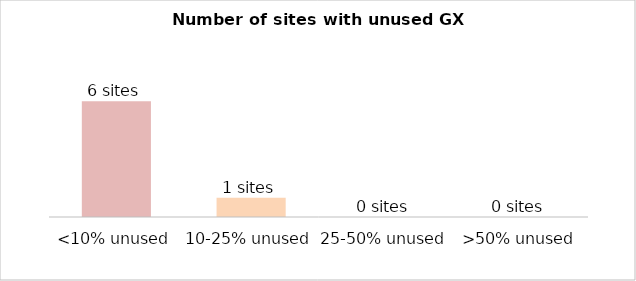
| Category | <10% unused |
|---|---|
| <10% unused | 6 |
| 10-25% unused | 1 |
| 25-50% unused | 0 |
| >50% unused | 0 |